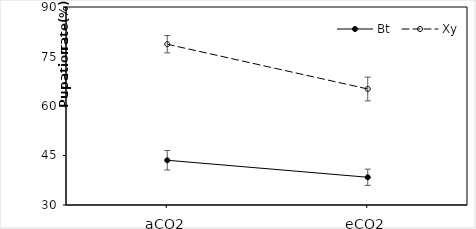
| Category | Bt | Xy |
|---|---|---|
| aCO2 | 43.557 | 78.713 |
| eCO2 | 38.407 | 65.157 |